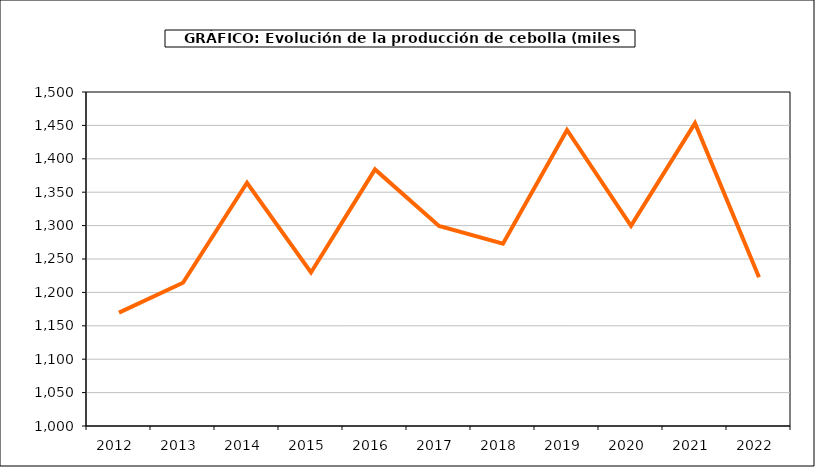
| Category | producción |
|---|---|
| 2012.0 | 1169.721 |
| 2013.0 | 1214.501 |
| 2014.0 | 1364.117 |
| 2015.0 | 1229.842 |
| 2016.0 | 1384.098 |
| 2017.0 | 1299.534 |
| 2018.0 | 1272.928 |
| 2019.0 | 1443.187 |
| 2020.0 | 1299.723 |
| 2021.0 | 1453.415 |
| 2022.0 | 1222.604 |